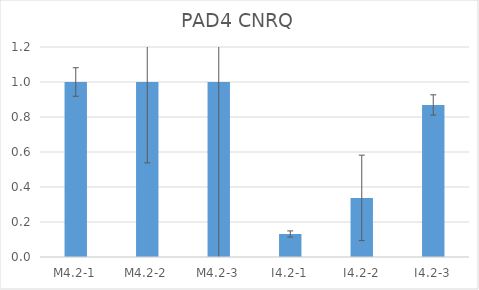
| Category | PAD4 CNRQ |
|---|---|
| M4.2-1 | 1 |
| M4.2-2 | 1 |
| M4.2-3 | 1 |
| I4.2-1 | 0.131 |
| I4.2-2 | 0.338 |
| I4.2-3 | 0.869 |